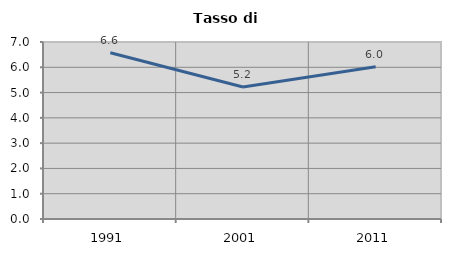
| Category | Tasso di disoccupazione   |
|---|---|
| 1991.0 | 6.575 |
| 2001.0 | 5.223 |
| 2011.0 | 6.024 |